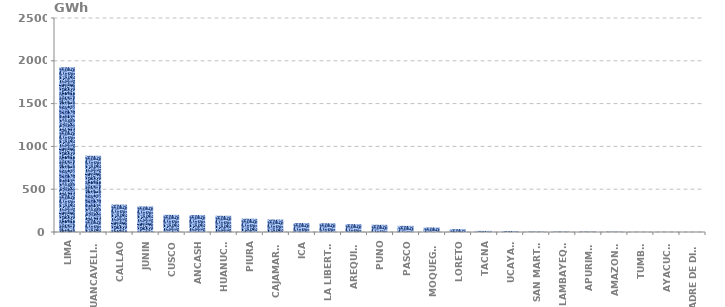
| Category | Series 0 |
|---|---|
| LIMA | 1923.829 |
| HUANCAVELICA | 891.242 |
| CALLAO | 319.943 |
| JUNIN | 298.527 |
| CUSCO | 200.131 |
| ANCASH | 197.457 |
| HUANUCO | 189.441 |
| PIURA | 155.315 |
| CAJAMARCA | 145.364 |
| ICA | 104.113 |
| LA LIBERTAD | 101.822 |
| AREQUIPA | 91.5 |
| PUNO | 84.242 |
| PASCO | 71.808 |
| MOQUEGUA | 52.749 |
| LORETO | 33.632 |
| TACNA | 12.883 |
| UCAYALI | 11.265 |
| SAN MARTÍN | 4.941 |
| LAMBAYEQUE | 4.807 |
| APURIMAC | 4.607 |
| AMAZONAS | 3.67 |
| TUMBES | 1.101 |
| AYACUCHO | 0.925 |
| MADRE DE DIOS | 0.099 |